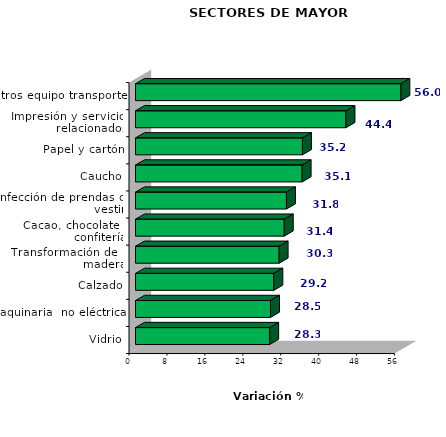
| Category | Series 0 |
|---|---|
| Otros equipo transporte | 55.954 |
| Impresión y servicios relacionados | 44.379 |
| Papel y cartón | 35.201 |
| Caucho | 35.138 |
| Confección de prendas de vestir | 31.832 |
| Cacao, chocolate y confitería | 31.363 |
| Transformación de la madera | 30.288 |
| Calzado | 29.172 |
| Maquinaria  no eléctrica | 28.464 |
| Vidrio | 28.294 |